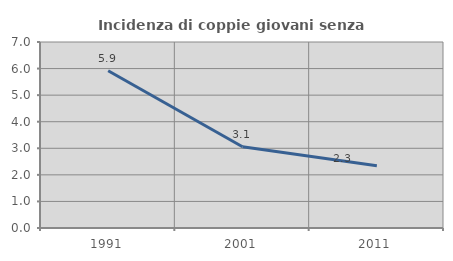
| Category | Incidenza di coppie giovani senza figli |
|---|---|
| 1991.0 | 5.915 |
| 2001.0 | 3.056 |
| 2011.0 | 2.339 |